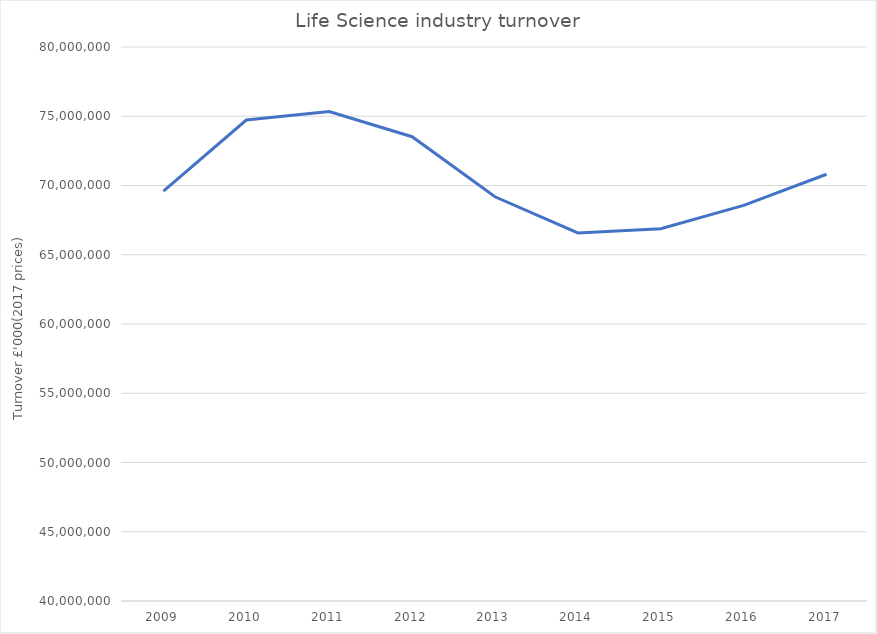
| Category | Life Science industry turnover |
|---|---|
| 2009 | 69600461 |
| 2010 | 74728948 |
| 2011 | 75341806 |
| 2012 | 73521090 |
| 2013 | 69185116 |
| 2014 | 66578324 |
| 2015 | 66876580 |
| 2016 | 68564598 |
| 2017 | 70810772 |